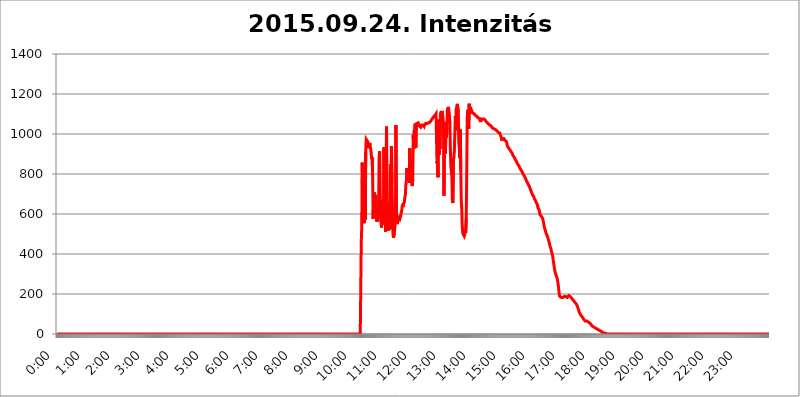
| Category | 2015.09.24. Intenzitás [W/m^2] |
|---|---|
| 0.0 | 0 |
| 0.0006944444444444445 | 0 |
| 0.001388888888888889 | 0 |
| 0.0020833333333333333 | 0 |
| 0.002777777777777778 | 0 |
| 0.003472222222222222 | 0 |
| 0.004166666666666667 | 0 |
| 0.004861111111111111 | 0 |
| 0.005555555555555556 | 0 |
| 0.0062499999999999995 | 0 |
| 0.006944444444444444 | 0 |
| 0.007638888888888889 | 0 |
| 0.008333333333333333 | 0 |
| 0.009027777777777779 | 0 |
| 0.009722222222222222 | 0 |
| 0.010416666666666666 | 0 |
| 0.011111111111111112 | 0 |
| 0.011805555555555555 | 0 |
| 0.012499999999999999 | 0 |
| 0.013194444444444444 | 0 |
| 0.013888888888888888 | 0 |
| 0.014583333333333332 | 0 |
| 0.015277777777777777 | 0 |
| 0.015972222222222224 | 0 |
| 0.016666666666666666 | 0 |
| 0.017361111111111112 | 0 |
| 0.018055555555555557 | 0 |
| 0.01875 | 0 |
| 0.019444444444444445 | 0 |
| 0.02013888888888889 | 0 |
| 0.020833333333333332 | 0 |
| 0.02152777777777778 | 0 |
| 0.022222222222222223 | 0 |
| 0.02291666666666667 | 0 |
| 0.02361111111111111 | 0 |
| 0.024305555555555556 | 0 |
| 0.024999999999999998 | 0 |
| 0.025694444444444447 | 0 |
| 0.02638888888888889 | 0 |
| 0.027083333333333334 | 0 |
| 0.027777777777777776 | 0 |
| 0.02847222222222222 | 0 |
| 0.029166666666666664 | 0 |
| 0.029861111111111113 | 0 |
| 0.030555555555555555 | 0 |
| 0.03125 | 0 |
| 0.03194444444444445 | 0 |
| 0.03263888888888889 | 0 |
| 0.03333333333333333 | 0 |
| 0.034027777777777775 | 0 |
| 0.034722222222222224 | 0 |
| 0.035416666666666666 | 0 |
| 0.036111111111111115 | 0 |
| 0.03680555555555556 | 0 |
| 0.0375 | 0 |
| 0.03819444444444444 | 0 |
| 0.03888888888888889 | 0 |
| 0.03958333333333333 | 0 |
| 0.04027777777777778 | 0 |
| 0.04097222222222222 | 0 |
| 0.041666666666666664 | 0 |
| 0.042361111111111106 | 0 |
| 0.04305555555555556 | 0 |
| 0.043750000000000004 | 0 |
| 0.044444444444444446 | 0 |
| 0.04513888888888889 | 0 |
| 0.04583333333333334 | 0 |
| 0.04652777777777778 | 0 |
| 0.04722222222222222 | 0 |
| 0.04791666666666666 | 0 |
| 0.04861111111111111 | 0 |
| 0.049305555555555554 | 0 |
| 0.049999999999999996 | 0 |
| 0.05069444444444445 | 0 |
| 0.051388888888888894 | 0 |
| 0.052083333333333336 | 0 |
| 0.05277777777777778 | 0 |
| 0.05347222222222222 | 0 |
| 0.05416666666666667 | 0 |
| 0.05486111111111111 | 0 |
| 0.05555555555555555 | 0 |
| 0.05625 | 0 |
| 0.05694444444444444 | 0 |
| 0.057638888888888885 | 0 |
| 0.05833333333333333 | 0 |
| 0.05902777777777778 | 0 |
| 0.059722222222222225 | 0 |
| 0.06041666666666667 | 0 |
| 0.061111111111111116 | 0 |
| 0.06180555555555556 | 0 |
| 0.0625 | 0 |
| 0.06319444444444444 | 0 |
| 0.06388888888888888 | 0 |
| 0.06458333333333334 | 0 |
| 0.06527777777777778 | 0 |
| 0.06597222222222222 | 0 |
| 0.06666666666666667 | 0 |
| 0.06736111111111111 | 0 |
| 0.06805555555555555 | 0 |
| 0.06874999999999999 | 0 |
| 0.06944444444444443 | 0 |
| 0.07013888888888889 | 0 |
| 0.07083333333333333 | 0 |
| 0.07152777777777779 | 0 |
| 0.07222222222222223 | 0 |
| 0.07291666666666667 | 0 |
| 0.07361111111111111 | 0 |
| 0.07430555555555556 | 0 |
| 0.075 | 0 |
| 0.07569444444444444 | 0 |
| 0.0763888888888889 | 0 |
| 0.07708333333333334 | 0 |
| 0.07777777777777778 | 0 |
| 0.07847222222222222 | 0 |
| 0.07916666666666666 | 0 |
| 0.0798611111111111 | 0 |
| 0.08055555555555556 | 0 |
| 0.08125 | 0 |
| 0.08194444444444444 | 0 |
| 0.08263888888888889 | 0 |
| 0.08333333333333333 | 0 |
| 0.08402777777777777 | 0 |
| 0.08472222222222221 | 0 |
| 0.08541666666666665 | 0 |
| 0.08611111111111112 | 0 |
| 0.08680555555555557 | 0 |
| 0.08750000000000001 | 0 |
| 0.08819444444444445 | 0 |
| 0.08888888888888889 | 0 |
| 0.08958333333333333 | 0 |
| 0.09027777777777778 | 0 |
| 0.09097222222222222 | 0 |
| 0.09166666666666667 | 0 |
| 0.09236111111111112 | 0 |
| 0.09305555555555556 | 0 |
| 0.09375 | 0 |
| 0.09444444444444444 | 0 |
| 0.09513888888888888 | 0 |
| 0.09583333333333333 | 0 |
| 0.09652777777777777 | 0 |
| 0.09722222222222222 | 0 |
| 0.09791666666666667 | 0 |
| 0.09861111111111111 | 0 |
| 0.09930555555555555 | 0 |
| 0.09999999999999999 | 0 |
| 0.10069444444444443 | 0 |
| 0.1013888888888889 | 0 |
| 0.10208333333333335 | 0 |
| 0.10277777777777779 | 0 |
| 0.10347222222222223 | 0 |
| 0.10416666666666667 | 0 |
| 0.10486111111111111 | 0 |
| 0.10555555555555556 | 0 |
| 0.10625 | 0 |
| 0.10694444444444444 | 0 |
| 0.1076388888888889 | 0 |
| 0.10833333333333334 | 0 |
| 0.10902777777777778 | 0 |
| 0.10972222222222222 | 0 |
| 0.1111111111111111 | 0 |
| 0.11180555555555556 | 0 |
| 0.11180555555555556 | 0 |
| 0.1125 | 0 |
| 0.11319444444444444 | 0 |
| 0.11388888888888889 | 0 |
| 0.11458333333333333 | 0 |
| 0.11527777777777777 | 0 |
| 0.11597222222222221 | 0 |
| 0.11666666666666665 | 0 |
| 0.1173611111111111 | 0 |
| 0.11805555555555557 | 0 |
| 0.11944444444444445 | 0 |
| 0.12013888888888889 | 0 |
| 0.12083333333333333 | 0 |
| 0.12152777777777778 | 0 |
| 0.12222222222222223 | 0 |
| 0.12291666666666667 | 0 |
| 0.12291666666666667 | 0 |
| 0.12361111111111112 | 0 |
| 0.12430555555555556 | 0 |
| 0.125 | 0 |
| 0.12569444444444444 | 0 |
| 0.12638888888888888 | 0 |
| 0.12708333333333333 | 0 |
| 0.16875 | 0 |
| 0.12847222222222224 | 0 |
| 0.12916666666666668 | 0 |
| 0.12986111111111112 | 0 |
| 0.13055555555555556 | 0 |
| 0.13125 | 0 |
| 0.13194444444444445 | 0 |
| 0.1326388888888889 | 0 |
| 0.13333333333333333 | 0 |
| 0.13402777777777777 | 0 |
| 0.13402777777777777 | 0 |
| 0.13472222222222222 | 0 |
| 0.13541666666666666 | 0 |
| 0.1361111111111111 | 0 |
| 0.13749999999999998 | 0 |
| 0.13819444444444443 | 0 |
| 0.1388888888888889 | 0 |
| 0.13958333333333334 | 0 |
| 0.14027777777777778 | 0 |
| 0.14097222222222222 | 0 |
| 0.14166666666666666 | 0 |
| 0.1423611111111111 | 0 |
| 0.14305555555555557 | 0 |
| 0.14375000000000002 | 0 |
| 0.14444444444444446 | 0 |
| 0.1451388888888889 | 0 |
| 0.1451388888888889 | 0 |
| 0.14652777777777778 | 0 |
| 0.14722222222222223 | 0 |
| 0.14791666666666667 | 0 |
| 0.1486111111111111 | 0 |
| 0.14930555555555555 | 0 |
| 0.15 | 0 |
| 0.15069444444444444 | 0 |
| 0.15138888888888888 | 0 |
| 0.15208333333333332 | 0 |
| 0.15277777777777776 | 0 |
| 0.15347222222222223 | 0 |
| 0.15416666666666667 | 0 |
| 0.15486111111111112 | 0 |
| 0.15555555555555556 | 0 |
| 0.15625 | 0 |
| 0.15694444444444444 | 0 |
| 0.15763888888888888 | 0 |
| 0.15833333333333333 | 0 |
| 0.15902777777777777 | 0 |
| 0.15972222222222224 | 0 |
| 0.16041666666666668 | 0 |
| 0.16111111111111112 | 0 |
| 0.16180555555555556 | 0 |
| 0.1625 | 0 |
| 0.16319444444444445 | 0 |
| 0.1638888888888889 | 0 |
| 0.16458333333333333 | 0 |
| 0.16527777777777777 | 0 |
| 0.16597222222222222 | 0 |
| 0.16666666666666666 | 0 |
| 0.1673611111111111 | 0 |
| 0.16805555555555554 | 0 |
| 0.16874999999999998 | 0 |
| 0.16944444444444443 | 0 |
| 0.17013888888888887 | 0 |
| 0.1708333333333333 | 0 |
| 0.17152777777777775 | 0 |
| 0.17222222222222225 | 0 |
| 0.1729166666666667 | 0 |
| 0.17361111111111113 | 0 |
| 0.17430555555555557 | 0 |
| 0.17500000000000002 | 0 |
| 0.17569444444444446 | 0 |
| 0.1763888888888889 | 0 |
| 0.17708333333333334 | 0 |
| 0.17777777777777778 | 0 |
| 0.17847222222222223 | 0 |
| 0.17916666666666667 | 0 |
| 0.1798611111111111 | 0 |
| 0.18055555555555555 | 0 |
| 0.18125 | 0 |
| 0.18194444444444444 | 0 |
| 0.1826388888888889 | 0 |
| 0.18333333333333335 | 0 |
| 0.1840277777777778 | 0 |
| 0.18472222222222223 | 0 |
| 0.18541666666666667 | 0 |
| 0.18611111111111112 | 0 |
| 0.18680555555555556 | 0 |
| 0.1875 | 0 |
| 0.18819444444444444 | 0 |
| 0.18888888888888888 | 0 |
| 0.18958333333333333 | 0 |
| 0.19027777777777777 | 0 |
| 0.1909722222222222 | 0 |
| 0.19166666666666665 | 0 |
| 0.19236111111111112 | 0 |
| 0.19305555555555554 | 0 |
| 0.19375 | 0 |
| 0.19444444444444445 | 0 |
| 0.1951388888888889 | 0 |
| 0.19583333333333333 | 0 |
| 0.19652777777777777 | 0 |
| 0.19722222222222222 | 0 |
| 0.19791666666666666 | 0 |
| 0.1986111111111111 | 0 |
| 0.19930555555555554 | 0 |
| 0.19999999999999998 | 0 |
| 0.20069444444444443 | 0 |
| 0.20138888888888887 | 0 |
| 0.2020833333333333 | 0 |
| 0.2027777777777778 | 0 |
| 0.2034722222222222 | 0 |
| 0.2041666666666667 | 0 |
| 0.20486111111111113 | 0 |
| 0.20555555555555557 | 0 |
| 0.20625000000000002 | 0 |
| 0.20694444444444446 | 0 |
| 0.2076388888888889 | 0 |
| 0.20833333333333334 | 0 |
| 0.20902777777777778 | 0 |
| 0.20972222222222223 | 0 |
| 0.21041666666666667 | 0 |
| 0.2111111111111111 | 0 |
| 0.21180555555555555 | 0 |
| 0.2125 | 0 |
| 0.21319444444444444 | 0 |
| 0.2138888888888889 | 0 |
| 0.21458333333333335 | 0 |
| 0.2152777777777778 | 0 |
| 0.21597222222222223 | 0 |
| 0.21666666666666667 | 0 |
| 0.21736111111111112 | 0 |
| 0.21805555555555556 | 0 |
| 0.21875 | 0 |
| 0.21944444444444444 | 0 |
| 0.22013888888888888 | 0 |
| 0.22083333333333333 | 0 |
| 0.22152777777777777 | 0 |
| 0.2222222222222222 | 0 |
| 0.22291666666666665 | 0 |
| 0.2236111111111111 | 0 |
| 0.22430555555555556 | 0 |
| 0.225 | 0 |
| 0.22569444444444445 | 0 |
| 0.2263888888888889 | 0 |
| 0.22708333333333333 | 0 |
| 0.22777777777777777 | 0 |
| 0.22847222222222222 | 0 |
| 0.22916666666666666 | 0 |
| 0.2298611111111111 | 0 |
| 0.23055555555555554 | 0 |
| 0.23124999999999998 | 0 |
| 0.23194444444444443 | 0 |
| 0.23263888888888887 | 0 |
| 0.2333333333333333 | 0 |
| 0.2340277777777778 | 0 |
| 0.2347222222222222 | 0 |
| 0.2354166666666667 | 0 |
| 0.23611111111111113 | 0 |
| 0.23680555555555557 | 0 |
| 0.23750000000000002 | 0 |
| 0.23819444444444446 | 0 |
| 0.2388888888888889 | 0 |
| 0.23958333333333334 | 0 |
| 0.24027777777777778 | 0 |
| 0.24097222222222223 | 0 |
| 0.24166666666666667 | 0 |
| 0.2423611111111111 | 0 |
| 0.24305555555555555 | 0 |
| 0.24375 | 0 |
| 0.24444444444444446 | 0 |
| 0.24513888888888888 | 0 |
| 0.24583333333333335 | 0 |
| 0.2465277777777778 | 0 |
| 0.24722222222222223 | 0 |
| 0.24791666666666667 | 0 |
| 0.24861111111111112 | 0 |
| 0.24930555555555556 | 0 |
| 0.25 | 0 |
| 0.25069444444444444 | 0 |
| 0.2513888888888889 | 0 |
| 0.2520833333333333 | 0 |
| 0.25277777777777777 | 0 |
| 0.2534722222222222 | 0 |
| 0.25416666666666665 | 0 |
| 0.2548611111111111 | 0 |
| 0.2555555555555556 | 0 |
| 0.25625000000000003 | 0 |
| 0.2569444444444445 | 0 |
| 0.2576388888888889 | 0 |
| 0.25833333333333336 | 0 |
| 0.2590277777777778 | 0 |
| 0.25972222222222224 | 0 |
| 0.2604166666666667 | 0 |
| 0.2611111111111111 | 0 |
| 0.26180555555555557 | 0 |
| 0.2625 | 0 |
| 0.26319444444444445 | 0 |
| 0.2638888888888889 | 0 |
| 0.26458333333333334 | 0 |
| 0.2652777777777778 | 0 |
| 0.2659722222222222 | 0 |
| 0.26666666666666666 | 0 |
| 0.2673611111111111 | 0 |
| 0.26805555555555555 | 0 |
| 0.26875 | 0 |
| 0.26944444444444443 | 0 |
| 0.2701388888888889 | 0 |
| 0.2708333333333333 | 0 |
| 0.27152777777777776 | 0 |
| 0.2722222222222222 | 0 |
| 0.27291666666666664 | 0 |
| 0.2736111111111111 | 0 |
| 0.2743055555555555 | 0 |
| 0.27499999999999997 | 0 |
| 0.27569444444444446 | 0 |
| 0.27638888888888885 | 0 |
| 0.27708333333333335 | 0 |
| 0.2777777777777778 | 0 |
| 0.27847222222222223 | 0 |
| 0.2791666666666667 | 0 |
| 0.2798611111111111 | 0 |
| 0.28055555555555556 | 0 |
| 0.28125 | 0 |
| 0.28194444444444444 | 0 |
| 0.2826388888888889 | 0 |
| 0.2833333333333333 | 0 |
| 0.28402777777777777 | 0 |
| 0.2847222222222222 | 0 |
| 0.28541666666666665 | 0 |
| 0.28611111111111115 | 0 |
| 0.28680555555555554 | 0 |
| 0.28750000000000003 | 0 |
| 0.2881944444444445 | 0 |
| 0.2888888888888889 | 0 |
| 0.28958333333333336 | 0 |
| 0.2902777777777778 | 0 |
| 0.29097222222222224 | 0 |
| 0.2916666666666667 | 0 |
| 0.2923611111111111 | 0 |
| 0.29305555555555557 | 0 |
| 0.29375 | 0 |
| 0.29444444444444445 | 0 |
| 0.2951388888888889 | 0 |
| 0.29583333333333334 | 0 |
| 0.2965277777777778 | 0 |
| 0.2972222222222222 | 0 |
| 0.29791666666666666 | 0 |
| 0.2986111111111111 | 0 |
| 0.29930555555555555 | 0 |
| 0.3 | 0 |
| 0.30069444444444443 | 0 |
| 0.3013888888888889 | 0 |
| 0.3020833333333333 | 0 |
| 0.30277777777777776 | 0 |
| 0.3034722222222222 | 0 |
| 0.30416666666666664 | 0 |
| 0.3048611111111111 | 0 |
| 0.3055555555555555 | 0 |
| 0.30624999999999997 | 0 |
| 0.3069444444444444 | 0 |
| 0.3076388888888889 | 0 |
| 0.30833333333333335 | 0 |
| 0.3090277777777778 | 0 |
| 0.30972222222222223 | 0 |
| 0.3104166666666667 | 0 |
| 0.3111111111111111 | 0 |
| 0.31180555555555556 | 0 |
| 0.3125 | 0 |
| 0.31319444444444444 | 0 |
| 0.3138888888888889 | 0 |
| 0.3145833333333333 | 0 |
| 0.31527777777777777 | 0 |
| 0.3159722222222222 | 0 |
| 0.31666666666666665 | 0 |
| 0.31736111111111115 | 0 |
| 0.31805555555555554 | 0 |
| 0.31875000000000003 | 0 |
| 0.3194444444444445 | 0 |
| 0.3201388888888889 | 0 |
| 0.32083333333333336 | 0 |
| 0.3215277777777778 | 0 |
| 0.32222222222222224 | 0 |
| 0.3229166666666667 | 0 |
| 0.3236111111111111 | 0 |
| 0.32430555555555557 | 0 |
| 0.325 | 0 |
| 0.32569444444444445 | 0 |
| 0.3263888888888889 | 0 |
| 0.32708333333333334 | 0 |
| 0.3277777777777778 | 0 |
| 0.3284722222222222 | 0 |
| 0.32916666666666666 | 0 |
| 0.3298611111111111 | 0 |
| 0.33055555555555555 | 0 |
| 0.33125 | 0 |
| 0.33194444444444443 | 0 |
| 0.3326388888888889 | 0 |
| 0.3333333333333333 | 0 |
| 0.3340277777777778 | 0 |
| 0.3347222222222222 | 0 |
| 0.3354166666666667 | 0 |
| 0.3361111111111111 | 0 |
| 0.3368055555555556 | 0 |
| 0.33749999999999997 | 0 |
| 0.33819444444444446 | 0 |
| 0.33888888888888885 | 0 |
| 0.33958333333333335 | 0 |
| 0.34027777777777773 | 0 |
| 0.34097222222222223 | 0 |
| 0.3416666666666666 | 0 |
| 0.3423611111111111 | 0 |
| 0.3430555555555555 | 0 |
| 0.34375 | 0 |
| 0.3444444444444445 | 0 |
| 0.3451388888888889 | 0 |
| 0.3458333333333334 | 0 |
| 0.34652777777777777 | 0 |
| 0.34722222222222227 | 0 |
| 0.34791666666666665 | 0 |
| 0.34861111111111115 | 0 |
| 0.34930555555555554 | 0 |
| 0.35000000000000003 | 0 |
| 0.3506944444444444 | 0 |
| 0.3513888888888889 | 0 |
| 0.3520833333333333 | 0 |
| 0.3527777777777778 | 0 |
| 0.3534722222222222 | 0 |
| 0.3541666666666667 | 0 |
| 0.3548611111111111 | 0 |
| 0.35555555555555557 | 0 |
| 0.35625 | 0 |
| 0.35694444444444445 | 0 |
| 0.3576388888888889 | 0 |
| 0.35833333333333334 | 0 |
| 0.3590277777777778 | 0 |
| 0.3597222222222222 | 0 |
| 0.36041666666666666 | 0 |
| 0.3611111111111111 | 0 |
| 0.36180555555555555 | 0 |
| 0.3625 | 0 |
| 0.36319444444444443 | 0 |
| 0.3638888888888889 | 0 |
| 0.3645833333333333 | 0 |
| 0.3652777777777778 | 0 |
| 0.3659722222222222 | 0 |
| 0.3666666666666667 | 0 |
| 0.3673611111111111 | 0 |
| 0.3680555555555556 | 0 |
| 0.36874999999999997 | 0 |
| 0.36944444444444446 | 0 |
| 0.37013888888888885 | 0 |
| 0.37083333333333335 | 0 |
| 0.37152777777777773 | 0 |
| 0.37222222222222223 | 0 |
| 0.3729166666666666 | 0 |
| 0.3736111111111111 | 0 |
| 0.3743055555555555 | 0 |
| 0.375 | 0 |
| 0.3756944444444445 | 0 |
| 0.3763888888888889 | 0 |
| 0.3770833333333334 | 0 |
| 0.37777777777777777 | 0 |
| 0.37847222222222227 | 0 |
| 0.37916666666666665 | 0 |
| 0.37986111111111115 | 0 |
| 0.38055555555555554 | 0 |
| 0.38125000000000003 | 0 |
| 0.3819444444444444 | 0 |
| 0.3826388888888889 | 0 |
| 0.3833333333333333 | 0 |
| 0.3840277777777778 | 0 |
| 0.3847222222222222 | 0 |
| 0.3854166666666667 | 0 |
| 0.3861111111111111 | 0 |
| 0.38680555555555557 | 0 |
| 0.3875 | 0 |
| 0.38819444444444445 | 0 |
| 0.3888888888888889 | 0 |
| 0.38958333333333334 | 0 |
| 0.3902777777777778 | 0 |
| 0.3909722222222222 | 0 |
| 0.39166666666666666 | 0 |
| 0.3923611111111111 | 0 |
| 0.39305555555555555 | 0 |
| 0.39375 | 0 |
| 0.39444444444444443 | 0 |
| 0.3951388888888889 | 0 |
| 0.3958333333333333 | 0 |
| 0.3965277777777778 | 0 |
| 0.3972222222222222 | 0 |
| 0.3979166666666667 | 0 |
| 0.3986111111111111 | 0 |
| 0.3993055555555556 | 0 |
| 0.39999999999999997 | 0 |
| 0.40069444444444446 | 0 |
| 0.40138888888888885 | 0 |
| 0.40208333333333335 | 0 |
| 0.40277777777777773 | 0 |
| 0.40347222222222223 | 0 |
| 0.4041666666666666 | 0 |
| 0.4048611111111111 | 0 |
| 0.4055555555555555 | 0 |
| 0.40625 | 0 |
| 0.4069444444444445 | 0 |
| 0.4076388888888889 | 0 |
| 0.4083333333333334 | 0 |
| 0.40902777777777777 | 0 |
| 0.40972222222222227 | 0 |
| 0.41041666666666665 | 0 |
| 0.41111111111111115 | 0 |
| 0.41180555555555554 | 0 |
| 0.41250000000000003 | 0 |
| 0.4131944444444444 | 0 |
| 0.4138888888888889 | 0 |
| 0.4145833333333333 | 0 |
| 0.4152777777777778 | 0 |
| 0.4159722222222222 | 0 |
| 0.4166666666666667 | 0 |
| 0.4173611111111111 | 0 |
| 0.41805555555555557 | 0 |
| 0.41875 | 0 |
| 0.41944444444444445 | 0 |
| 0.4201388888888889 | 0 |
| 0.42083333333333334 | 0 |
| 0.4215277777777778 | 0 |
| 0.4222222222222222 | 0 |
| 0.42291666666666666 | 0 |
| 0.4236111111111111 | 0 |
| 0.42430555555555555 | 0 |
| 0.425 | 0 |
| 0.42569444444444443 | 0 |
| 0.4263888888888889 | 458.38 |
| 0.4270833333333333 | 532.513 |
| 0.4277777777777778 | 856.855 |
| 0.4284722222222222 | 600.661 |
| 0.4291666666666667 | 634.105 |
| 0.4298611111111111 | 571.049 |
| 0.4305555555555556 | 553.986 |
| 0.43124999999999997 | 759.723 |
| 0.43194444444444446 | 571.049 |
| 0.43263888888888885 | 909.996 |
| 0.43333333333333335 | 973.772 |
| 0.43402777777777773 | 973.772 |
| 0.43472222222222223 | 966.295 |
| 0.4354166666666666 | 962.555 |
| 0.4361111111111111 | 955.071 |
| 0.4368055555555555 | 928.819 |
| 0.4375 | 940.082 |
| 0.4381944444444445 | 955.071 |
| 0.4388888888888889 | 943.832 |
| 0.4395833333333334 | 940.082 |
| 0.44027777777777777 | 906.223 |
| 0.44097222222222227 | 875.918 |
| 0.44166666666666665 | 883.516 |
| 0.44236111111111115 | 791.169 |
| 0.44305555555555554 | 575.299 |
| 0.44375000000000003 | 667.123 |
| 0.4444444444444444 | 707.8 |
| 0.4451388888888889 | 671.22 |
| 0.4458333333333333 | 621.613 |
| 0.4465277777777778 | 695.666 |
| 0.4472222222222222 | 625.784 |
| 0.4479166666666667 | 562.53 |
| 0.4486111111111111 | 583.779 |
| 0.44930555555555557 | 562.53 |
| 0.45 | 600.661 |
| 0.45069444444444445 | 617.436 |
| 0.4513888888888889 | 879.719 |
| 0.45208333333333334 | 913.766 |
| 0.4527777777777778 | 634.105 |
| 0.4534722222222222 | 588.009 |
| 0.45416666666666666 | 553.986 |
| 0.4548611111111111 | 532.513 |
| 0.45555555555555555 | 663.019 |
| 0.45625 | 571.049 |
| 0.45694444444444443 | 671.22 |
| 0.4576388888888889 | 545.416 |
| 0.4583333333333333 | 932.576 |
| 0.4590277777777778 | 663.019 |
| 0.4597222222222222 | 868.305 |
| 0.4604166666666667 | 510.885 |
| 0.4611111111111111 | 798.974 |
| 0.4618055555555556 | 1037.277 |
| 0.46249999999999997 | 558.261 |
| 0.46319444444444446 | 663.019 |
| 0.46388888888888885 | 515.223 |
| 0.46458333333333335 | 545.416 |
| 0.46527777777777773 | 528.2 |
| 0.46597222222222223 | 562.53 |
| 0.4666666666666666 | 541.121 |
| 0.4673611111111111 | 849.199 |
| 0.4680555555555555 | 523.88 |
| 0.46875 | 940.082 |
| 0.4694444444444445 | 751.803 |
| 0.4701388888888889 | 625.784 |
| 0.4708333333333334 | 502.192 |
| 0.47152777777777777 | 480.356 |
| 0.47222222222222227 | 480.356 |
| 0.47291666666666665 | 506.542 |
| 0.47361111111111115 | 536.82 |
| 0.47430555555555554 | 566.793 |
| 0.47500000000000003 | 1044.762 |
| 0.4756944444444444 | 571.049 |
| 0.4763888888888889 | 558.261 |
| 0.4770833333333333 | 549.704 |
| 0.4777777777777778 | 566.793 |
| 0.4784722222222222 | 583.779 |
| 0.4791666666666667 | 588.009 |
| 0.4798611111111111 | 583.779 |
| 0.48055555555555557 | 575.299 |
| 0.48125 | 575.299 |
| 0.48194444444444445 | 596.45 |
| 0.4826388888888889 | 609.062 |
| 0.48333333333333334 | 621.613 |
| 0.4840277777777778 | 646.537 |
| 0.4847222222222222 | 634.105 |
| 0.48541666666666666 | 650.667 |
| 0.4861111111111111 | 654.791 |
| 0.48680555555555555 | 658.909 |
| 0.4875 | 683.473 |
| 0.48819444444444443 | 691.608 |
| 0.4888888888888889 | 743.859 |
| 0.4895833333333333 | 759.723 |
| 0.4902777777777778 | 829.981 |
| 0.4909722222222222 | 795.074 |
| 0.4916666666666667 | 775.492 |
| 0.4923611111111111 | 783.342 |
| 0.4930555555555556 | 806.757 |
| 0.49374999999999997 | 755.766 |
| 0.49444444444444446 | 928.819 |
| 0.49513888888888885 | 767.62 |
| 0.49583333333333335 | 872.114 |
| 0.49652777777777773 | 775.492 |
| 0.49722222222222223 | 751.803 |
| 0.4979166666666666 | 739.877 |
| 0.4986111111111111 | 771.559 |
| 0.4993055555555555 | 996.182 |
| 0.5 | 925.06 |
| 0.5006944444444444 | 1014.852 |
| 0.5013888888888889 | 1022.323 |
| 0.5020833333333333 | 1052.255 |
| 0.5027777777777778 | 932.576 |
| 0.5034722222222222 | 1003.65 |
| 0.5041666666666667 | 1052.255 |
| 0.5048611111111111 | 1048.508 |
| 0.5055555555555555 | 1056.004 |
| 0.50625 | 1056.004 |
| 0.5069444444444444 | 1048.508 |
| 0.5076388888888889 | 1041.019 |
| 0.5083333333333333 | 1041.019 |
| 0.5090277777777777 | 1037.277 |
| 0.5097222222222222 | 1033.537 |
| 0.5104166666666666 | 1037.277 |
| 0.5111111111111112 | 1044.762 |
| 0.5118055555555555 | 1044.762 |
| 0.5125000000000001 | 1044.762 |
| 0.5131944444444444 | 1044.762 |
| 0.513888888888889 | 1041.019 |
| 0.5145833333333333 | 1037.277 |
| 0.5152777777777778 | 1044.762 |
| 0.5159722222222222 | 1044.762 |
| 0.5166666666666667 | 1052.255 |
| 0.517361111111111 | 1052.255 |
| 0.5180555555555556 | 1052.255 |
| 0.5187499999999999 | 1052.255 |
| 0.5194444444444445 | 1048.508 |
| 0.5201388888888888 | 1048.508 |
| 0.5208333333333334 | 1056.004 |
| 0.5215277777777778 | 1059.756 |
| 0.5222222222222223 | 1056.004 |
| 0.5229166666666667 | 1059.756 |
| 0.5236111111111111 | 1059.756 |
| 0.5243055555555556 | 1067.267 |
| 0.525 | 1071.027 |
| 0.5256944444444445 | 1074.789 |
| 0.5263888888888889 | 1078.555 |
| 0.5270833333333333 | 1078.555 |
| 0.5277777777777778 | 1086.097 |
| 0.5284722222222222 | 1086.097 |
| 0.5291666666666667 | 1089.873 |
| 0.5298611111111111 | 1093.653 |
| 0.5305555555555556 | 1093.653 |
| 0.53125 | 1101.226 |
| 0.5319444444444444 | 1101.226 |
| 0.5326388888888889 | 853.029 |
| 0.5333333333333333 | 868.305 |
| 0.5340277777777778 | 783.342 |
| 0.5347222222222222 | 1071.027 |
| 0.5354166666666667 | 894.885 |
| 0.5361111111111111 | 943.832 |
| 0.5368055555555555 | 925.06 |
| 0.5375 | 1101.226 |
| 0.5381944444444444 | 1108.816 |
| 0.5388888888888889 | 1108.816 |
| 0.5395833333333333 | 1105.019 |
| 0.5402777777777777 | 1108.816 |
| 0.5409722222222222 | 1082.324 |
| 0.5416666666666666 | 1056.004 |
| 0.5423611111111112 | 691.608 |
| 0.5430555555555555 | 981.244 |
| 0.5437500000000001 | 921.298 |
| 0.5444444444444444 | 902.447 |
| 0.545138888888889 | 1059.756 |
| 0.5458333333333333 | 981.244 |
| 0.5465277777777778 | 1029.798 |
| 0.5472222222222222 | 1127.879 |
| 0.5479166666666667 | 1101.226 |
| 0.548611111111111 | 1135.543 |
| 0.5493055555555556 | 1135.543 |
| 0.5499999999999999 | 1131.708 |
| 0.5506944444444445 | 1052.255 |
| 0.5513888888888888 | 921.298 |
| 0.5520833333333334 | 837.682 |
| 0.5527777777777778 | 810.641 |
| 0.5534722222222223 | 787.258 |
| 0.5541666666666667 | 671.22 |
| 0.5548611111111111 | 654.791 |
| 0.5555555555555556 | 868.305 |
| 0.55625 | 883.516 |
| 0.5569444444444445 | 913.766 |
| 0.5576388888888889 | 917.534 |
| 0.5583333333333333 | 1089.873 |
| 0.5590277777777778 | 1018.587 |
| 0.5597222222222222 | 1124.056 |
| 0.5604166666666667 | 1124.056 |
| 0.5611111111111111 | 1150.946 |
| 0.5618055555555556 | 1147.086 |
| 0.5625 | 1108.816 |
| 0.5631944444444444 | 955.071 |
| 0.5638888888888889 | 932.576 |
| 0.5645833333333333 | 879.719 |
| 0.5652777777777778 | 1022.323 |
| 0.5659722222222222 | 818.392 |
| 0.5666666666666667 | 667.123 |
| 0.5673611111111111 | 625.784 |
| 0.5680555555555555 | 532.513 |
| 0.56875 | 506.542 |
| 0.5694444444444444 | 497.836 |
| 0.5701388888888889 | 493.475 |
| 0.5708333333333333 | 489.108 |
| 0.5715277777777777 | 497.836 |
| 0.5722222222222222 | 515.223 |
| 0.5729166666666666 | 506.542 |
| 0.5736111111111112 | 579.542 |
| 0.5743055555555555 | 802.868 |
| 0.5750000000000001 | 1078.555 |
| 0.5756944444444444 | 1120.238 |
| 0.576388888888889 | 1112.618 |
| 0.5770833333333333 | 1026.06 |
| 0.5777777777777778 | 1150.946 |
| 0.5784722222222222 | 1101.226 |
| 0.5791666666666667 | 1131.708 |
| 0.579861111111111 | 1124.056 |
| 0.5805555555555556 | 1105.019 |
| 0.5812499999999999 | 1116.426 |
| 0.5819444444444445 | 1112.618 |
| 0.5826388888888888 | 1105.019 |
| 0.5833333333333334 | 1101.226 |
| 0.5840277777777778 | 1101.226 |
| 0.5847222222222223 | 1101.226 |
| 0.5854166666666667 | 1097.437 |
| 0.5861111111111111 | 1093.653 |
| 0.5868055555555556 | 1089.873 |
| 0.5875 | 1089.873 |
| 0.5881944444444445 | 1089.873 |
| 0.5888888888888889 | 1086.097 |
| 0.5895833333333333 | 1082.324 |
| 0.5902777777777778 | 1082.324 |
| 0.5909722222222222 | 1078.555 |
| 0.5916666666666667 | 1078.555 |
| 0.5923611111111111 | 1074.789 |
| 0.5930555555555556 | 1067.267 |
| 0.59375 | 1059.756 |
| 0.5944444444444444 | 1074.789 |
| 0.5951388888888889 | 1074.789 |
| 0.5958333333333333 | 1071.027 |
| 0.5965277777777778 | 1074.789 |
| 0.5972222222222222 | 1074.789 |
| 0.5979166666666667 | 1074.789 |
| 0.5986111111111111 | 1074.789 |
| 0.5993055555555555 | 1071.027 |
| 0.6 | 1071.027 |
| 0.6006944444444444 | 1067.267 |
| 0.6013888888888889 | 1063.51 |
| 0.6020833333333333 | 1059.756 |
| 0.6027777777777777 | 1059.756 |
| 0.6034722222222222 | 1056.004 |
| 0.6041666666666666 | 1052.255 |
| 0.6048611111111112 | 1048.508 |
| 0.6055555555555555 | 1048.508 |
| 0.6062500000000001 | 1044.762 |
| 0.6069444444444444 | 1044.762 |
| 0.607638888888889 | 1044.762 |
| 0.6083333333333333 | 1041.019 |
| 0.6090277777777778 | 1041.019 |
| 0.6097222222222222 | 1037.277 |
| 0.6104166666666667 | 1029.798 |
| 0.611111111111111 | 1026.06 |
| 0.6118055555555556 | 1026.06 |
| 0.6124999999999999 | 1026.06 |
| 0.6131944444444445 | 1026.06 |
| 0.6138888888888888 | 1026.06 |
| 0.6145833333333334 | 1022.323 |
| 0.6152777777777778 | 1018.587 |
| 0.6159722222222223 | 1018.587 |
| 0.6166666666666667 | 1014.852 |
| 0.6173611111111111 | 1014.852 |
| 0.6180555555555556 | 1011.118 |
| 0.61875 | 1007.383 |
| 0.6194444444444445 | 1007.383 |
| 0.6201388888888889 | 1003.65 |
| 0.6208333333333333 | 1003.65 |
| 0.6215277777777778 | 996.182 |
| 0.6222222222222222 | 988.714 |
| 0.6229166666666667 | 977.508 |
| 0.6236111111111111 | 966.295 |
| 0.6243055555555556 | 977.508 |
| 0.625 | 977.508 |
| 0.6256944444444444 | 981.244 |
| 0.6263888888888889 | 977.508 |
| 0.6270833333333333 | 973.772 |
| 0.6277777777777778 | 970.034 |
| 0.6284722222222222 | 970.034 |
| 0.6291666666666667 | 966.295 |
| 0.6298611111111111 | 962.555 |
| 0.6305555555555555 | 955.071 |
| 0.63125 | 940.082 |
| 0.6319444444444444 | 940.082 |
| 0.6326388888888889 | 932.576 |
| 0.6333333333333333 | 928.819 |
| 0.6340277777777777 | 925.06 |
| 0.6347222222222222 | 925.06 |
| 0.6354166666666666 | 917.534 |
| 0.6361111111111112 | 913.766 |
| 0.6368055555555555 | 909.996 |
| 0.6375000000000001 | 906.223 |
| 0.6381944444444444 | 902.447 |
| 0.638888888888889 | 894.885 |
| 0.6395833333333333 | 894.885 |
| 0.6402777777777778 | 887.309 |
| 0.6409722222222222 | 883.516 |
| 0.6416666666666667 | 879.719 |
| 0.642361111111111 | 872.114 |
| 0.6430555555555556 | 868.305 |
| 0.6437499999999999 | 864.493 |
| 0.6444444444444445 | 860.676 |
| 0.6451388888888888 | 853.029 |
| 0.6458333333333334 | 849.199 |
| 0.6465277777777778 | 845.365 |
| 0.6472222222222223 | 841.526 |
| 0.6479166666666667 | 837.682 |
| 0.6486111111111111 | 829.981 |
| 0.6493055555555556 | 826.123 |
| 0.65 | 826.123 |
| 0.6506944444444445 | 818.392 |
| 0.6513888888888889 | 814.519 |
| 0.6520833333333333 | 810.641 |
| 0.6527777777777778 | 802.868 |
| 0.6534722222222222 | 798.974 |
| 0.6541666666666667 | 795.074 |
| 0.6548611111111111 | 795.074 |
| 0.6555555555555556 | 787.258 |
| 0.65625 | 783.342 |
| 0.6569444444444444 | 775.492 |
| 0.6576388888888889 | 771.559 |
| 0.6583333333333333 | 763.674 |
| 0.6590277777777778 | 763.674 |
| 0.6597222222222222 | 755.766 |
| 0.6604166666666667 | 747.834 |
| 0.6611111111111111 | 743.859 |
| 0.6618055555555555 | 739.877 |
| 0.6625 | 735.89 |
| 0.6631944444444444 | 727.896 |
| 0.6638888888888889 | 719.877 |
| 0.6645833333333333 | 715.858 |
| 0.6652777777777777 | 707.8 |
| 0.6659722222222222 | 703.762 |
| 0.6666666666666666 | 695.666 |
| 0.6673611111111111 | 695.666 |
| 0.6680555555555556 | 687.544 |
| 0.6687500000000001 | 683.473 |
| 0.6694444444444444 | 675.311 |
| 0.6701388888888888 | 675.311 |
| 0.6708333333333334 | 667.123 |
| 0.6715277777777778 | 658.909 |
| 0.6722222222222222 | 654.791 |
| 0.6729166666666666 | 650.667 |
| 0.6736111111111112 | 642.4 |
| 0.6743055555555556 | 629.948 |
| 0.6749999999999999 | 629.948 |
| 0.6756944444444444 | 621.613 |
| 0.6763888888888889 | 613.252 |
| 0.6770833333333334 | 596.45 |
| 0.6777777777777777 | 592.233 |
| 0.6784722222222223 | 592.233 |
| 0.6791666666666667 | 588.009 |
| 0.6798611111111111 | 583.779 |
| 0.6805555555555555 | 579.542 |
| 0.68125 | 571.049 |
| 0.6819444444444445 | 558.261 |
| 0.6826388888888889 | 545.416 |
| 0.6833333333333332 | 532.513 |
| 0.6840277777777778 | 523.88 |
| 0.6847222222222222 | 515.223 |
| 0.6854166666666667 | 506.542 |
| 0.686111111111111 | 502.192 |
| 0.6868055555555556 | 493.475 |
| 0.6875 | 489.108 |
| 0.6881944444444444 | 480.356 |
| 0.688888888888889 | 471.582 |
| 0.6895833333333333 | 462.786 |
| 0.6902777777777778 | 453.968 |
| 0.6909722222222222 | 440.702 |
| 0.6916666666666668 | 436.27 |
| 0.6923611111111111 | 427.39 |
| 0.6930555555555555 | 414.035 |
| 0.69375 | 405.108 |
| 0.6944444444444445 | 396.164 |
| 0.6951388888888889 | 382.715 |
| 0.6958333333333333 | 364.728 |
| 0.6965277777777777 | 346.682 |
| 0.6972222222222223 | 328.584 |
| 0.6979166666666666 | 314.98 |
| 0.6986111111111111 | 305.898 |
| 0.6993055555555556 | 296.808 |
| 0.7000000000000001 | 292.259 |
| 0.7006944444444444 | 283.156 |
| 0.7013888888888888 | 274.047 |
| 0.7020833333333334 | 260.373 |
| 0.7027777777777778 | 242.127 |
| 0.7034722222222222 | 219.309 |
| 0.7041666666666666 | 196.497 |
| 0.7048611111111112 | 187.378 |
| 0.7055555555555556 | 182.82 |
| 0.7062499999999999 | 182.82 |
| 0.7069444444444444 | 182.82 |
| 0.7076388888888889 | 182.82 |
| 0.7083333333333334 | 182.82 |
| 0.7090277777777777 | 182.82 |
| 0.7097222222222223 | 187.378 |
| 0.7104166666666667 | 187.378 |
| 0.7111111111111111 | 187.378 |
| 0.7118055555555555 | 187.378 |
| 0.7125 | 187.378 |
| 0.7131944444444445 | 187.378 |
| 0.7138888888888889 | 182.82 |
| 0.7145833333333332 | 182.82 |
| 0.7152777777777778 | 182.82 |
| 0.7159722222222222 | 187.378 |
| 0.7166666666666667 | 187.378 |
| 0.717361111111111 | 191.937 |
| 0.7180555555555556 | 187.378 |
| 0.71875 | 187.378 |
| 0.7194444444444444 | 187.378 |
| 0.720138888888889 | 182.82 |
| 0.7208333333333333 | 182.82 |
| 0.7215277777777778 | 178.264 |
| 0.7222222222222222 | 173.709 |
| 0.7229166666666668 | 173.709 |
| 0.7236111111111111 | 169.156 |
| 0.7243055555555555 | 164.605 |
| 0.725 | 164.605 |
| 0.7256944444444445 | 160.056 |
| 0.7263888888888889 | 155.509 |
| 0.7270833333333333 | 155.509 |
| 0.7277777777777777 | 150.964 |
| 0.7284722222222223 | 146.423 |
| 0.7291666666666666 | 141.884 |
| 0.7298611111111111 | 137.347 |
| 0.7305555555555556 | 128.284 |
| 0.7312500000000001 | 119.235 |
| 0.7319444444444444 | 110.201 |
| 0.7326388888888888 | 105.69 |
| 0.7333333333333334 | 101.184 |
| 0.7340277777777778 | 96.682 |
| 0.7347222222222222 | 92.184 |
| 0.7354166666666666 | 87.692 |
| 0.7361111111111112 | 87.692 |
| 0.7368055555555556 | 83.205 |
| 0.7374999999999999 | 78.722 |
| 0.7381944444444444 | 74.246 |
| 0.7388888888888889 | 74.246 |
| 0.7395833333333334 | 69.775 |
| 0.7402777777777777 | 65.31 |
| 0.7409722222222223 | 65.31 |
| 0.7416666666666667 | 65.31 |
| 0.7423611111111111 | 65.31 |
| 0.7430555555555555 | 60.85 |
| 0.74375 | 60.85 |
| 0.7444444444444445 | 60.85 |
| 0.7451388888888889 | 56.398 |
| 0.7458333333333332 | 56.398 |
| 0.7465277777777778 | 56.398 |
| 0.7472222222222222 | 51.951 |
| 0.7479166666666667 | 51.951 |
| 0.748611111111111 | 47.511 |
| 0.7493055555555556 | 43.079 |
| 0.75 | 43.079 |
| 0.7506944444444444 | 38.653 |
| 0.751388888888889 | 38.653 |
| 0.7520833333333333 | 38.653 |
| 0.7527777777777778 | 34.234 |
| 0.7534722222222222 | 34.234 |
| 0.7541666666666668 | 29.823 |
| 0.7548611111111111 | 29.823 |
| 0.7555555555555555 | 29.823 |
| 0.75625 | 25.419 |
| 0.7569444444444445 | 25.419 |
| 0.7576388888888889 | 21.024 |
| 0.7583333333333333 | 21.024 |
| 0.7590277777777777 | 21.024 |
| 0.7597222222222223 | 16.636 |
| 0.7604166666666666 | 16.636 |
| 0.7611111111111111 | 16.636 |
| 0.7618055555555556 | 12.257 |
| 0.7625000000000001 | 12.257 |
| 0.7631944444444444 | 12.257 |
| 0.7638888888888888 | 12.257 |
| 0.7645833333333334 | 7.887 |
| 0.7652777777777778 | 7.887 |
| 0.7659722222222222 | 7.887 |
| 0.7666666666666666 | 3.525 |
| 0.7673611111111112 | 3.525 |
| 0.7680555555555556 | 3.525 |
| 0.7687499999999999 | 3.525 |
| 0.7694444444444444 | 3.525 |
| 0.7701388888888889 | 3.525 |
| 0.7708333333333334 | 0 |
| 0.7715277777777777 | 0 |
| 0.7722222222222223 | 0 |
| 0.7729166666666667 | 0 |
| 0.7736111111111111 | 0 |
| 0.7743055555555555 | 0 |
| 0.775 | 0 |
| 0.7756944444444445 | 0 |
| 0.7763888888888889 | 0 |
| 0.7770833333333332 | 0 |
| 0.7777777777777778 | 0 |
| 0.7784722222222222 | 0 |
| 0.7791666666666667 | 0 |
| 0.779861111111111 | 0 |
| 0.7805555555555556 | 0 |
| 0.78125 | 0 |
| 0.7819444444444444 | 0 |
| 0.782638888888889 | 0 |
| 0.7833333333333333 | 0 |
| 0.7840277777777778 | 0 |
| 0.7847222222222222 | 0 |
| 0.7854166666666668 | 0 |
| 0.7861111111111111 | 0 |
| 0.7868055555555555 | 0 |
| 0.7875 | 0 |
| 0.7881944444444445 | 0 |
| 0.7888888888888889 | 0 |
| 0.7895833333333333 | 0 |
| 0.7902777777777777 | 0 |
| 0.7909722222222223 | 0 |
| 0.7916666666666666 | 0 |
| 0.7923611111111111 | 0 |
| 0.7930555555555556 | 0 |
| 0.7937500000000001 | 0 |
| 0.7944444444444444 | 0 |
| 0.7951388888888888 | 0 |
| 0.7958333333333334 | 0 |
| 0.7965277777777778 | 0 |
| 0.7972222222222222 | 0 |
| 0.7979166666666666 | 0 |
| 0.7986111111111112 | 0 |
| 0.7993055555555556 | 0 |
| 0.7999999999999999 | 0 |
| 0.8006944444444444 | 0 |
| 0.8013888888888889 | 0 |
| 0.8020833333333334 | 0 |
| 0.8027777777777777 | 0 |
| 0.8034722222222223 | 0 |
| 0.8041666666666667 | 0 |
| 0.8048611111111111 | 0 |
| 0.8055555555555555 | 0 |
| 0.80625 | 0 |
| 0.8069444444444445 | 0 |
| 0.8076388888888889 | 0 |
| 0.8083333333333332 | 0 |
| 0.8090277777777778 | 0 |
| 0.8097222222222222 | 0 |
| 0.8104166666666667 | 0 |
| 0.811111111111111 | 0 |
| 0.8118055555555556 | 0 |
| 0.8125 | 0 |
| 0.8131944444444444 | 0 |
| 0.813888888888889 | 0 |
| 0.8145833333333333 | 0 |
| 0.8152777777777778 | 0 |
| 0.8159722222222222 | 0 |
| 0.8166666666666668 | 0 |
| 0.8173611111111111 | 0 |
| 0.8180555555555555 | 0 |
| 0.81875 | 0 |
| 0.8194444444444445 | 0 |
| 0.8201388888888889 | 0 |
| 0.8208333333333333 | 0 |
| 0.8215277777777777 | 0 |
| 0.8222222222222223 | 0 |
| 0.8229166666666666 | 0 |
| 0.8236111111111111 | 0 |
| 0.8243055555555556 | 0 |
| 0.8250000000000001 | 0 |
| 0.8256944444444444 | 0 |
| 0.8263888888888888 | 0 |
| 0.8270833333333334 | 0 |
| 0.8277777777777778 | 0 |
| 0.8284722222222222 | 0 |
| 0.8291666666666666 | 0 |
| 0.8298611111111112 | 0 |
| 0.8305555555555556 | 0 |
| 0.8312499999999999 | 0 |
| 0.8319444444444444 | 0 |
| 0.8326388888888889 | 0 |
| 0.8333333333333334 | 0 |
| 0.8340277777777777 | 0 |
| 0.8347222222222223 | 0 |
| 0.8354166666666667 | 0 |
| 0.8361111111111111 | 0 |
| 0.8368055555555555 | 0 |
| 0.8375 | 0 |
| 0.8381944444444445 | 0 |
| 0.8388888888888889 | 0 |
| 0.8395833333333332 | 0 |
| 0.8402777777777778 | 0 |
| 0.8409722222222222 | 0 |
| 0.8416666666666667 | 0 |
| 0.842361111111111 | 0 |
| 0.8430555555555556 | 0 |
| 0.84375 | 0 |
| 0.8444444444444444 | 0 |
| 0.845138888888889 | 0 |
| 0.8458333333333333 | 0 |
| 0.8465277777777778 | 0 |
| 0.8472222222222222 | 0 |
| 0.8479166666666668 | 0 |
| 0.8486111111111111 | 0 |
| 0.8493055555555555 | 0 |
| 0.85 | 0 |
| 0.8506944444444445 | 0 |
| 0.8513888888888889 | 0 |
| 0.8520833333333333 | 0 |
| 0.8527777777777777 | 0 |
| 0.8534722222222223 | 0 |
| 0.8541666666666666 | 0 |
| 0.8548611111111111 | 0 |
| 0.8555555555555556 | 0 |
| 0.8562500000000001 | 0 |
| 0.8569444444444444 | 0 |
| 0.8576388888888888 | 0 |
| 0.8583333333333334 | 0 |
| 0.8590277777777778 | 0 |
| 0.8597222222222222 | 0 |
| 0.8604166666666666 | 0 |
| 0.8611111111111112 | 0 |
| 0.8618055555555556 | 0 |
| 0.8624999999999999 | 0 |
| 0.8631944444444444 | 0 |
| 0.8638888888888889 | 0 |
| 0.8645833333333334 | 0 |
| 0.8652777777777777 | 0 |
| 0.8659722222222223 | 0 |
| 0.8666666666666667 | 0 |
| 0.8673611111111111 | 0 |
| 0.8680555555555555 | 0 |
| 0.86875 | 0 |
| 0.8694444444444445 | 0 |
| 0.8701388888888889 | 0 |
| 0.8708333333333332 | 0 |
| 0.8715277777777778 | 0 |
| 0.8722222222222222 | 0 |
| 0.8729166666666667 | 0 |
| 0.873611111111111 | 0 |
| 0.8743055555555556 | 0 |
| 0.875 | 0 |
| 0.8756944444444444 | 0 |
| 0.876388888888889 | 0 |
| 0.8770833333333333 | 0 |
| 0.8777777777777778 | 0 |
| 0.8784722222222222 | 0 |
| 0.8791666666666668 | 0 |
| 0.8798611111111111 | 0 |
| 0.8805555555555555 | 0 |
| 0.88125 | 0 |
| 0.8819444444444445 | 0 |
| 0.8826388888888889 | 0 |
| 0.8833333333333333 | 0 |
| 0.8840277777777777 | 0 |
| 0.8847222222222223 | 0 |
| 0.8854166666666666 | 0 |
| 0.8861111111111111 | 0 |
| 0.8868055555555556 | 0 |
| 0.8875000000000001 | 0 |
| 0.8881944444444444 | 0 |
| 0.8888888888888888 | 0 |
| 0.8895833333333334 | 0 |
| 0.8902777777777778 | 0 |
| 0.8909722222222222 | 0 |
| 0.8916666666666666 | 0 |
| 0.8923611111111112 | 0 |
| 0.8930555555555556 | 0 |
| 0.8937499999999999 | 0 |
| 0.8944444444444444 | 0 |
| 0.8951388888888889 | 0 |
| 0.8958333333333334 | 0 |
| 0.8965277777777777 | 0 |
| 0.8972222222222223 | 0 |
| 0.8979166666666667 | 0 |
| 0.8986111111111111 | 0 |
| 0.8993055555555555 | 0 |
| 0.9 | 0 |
| 0.9006944444444445 | 0 |
| 0.9013888888888889 | 0 |
| 0.9020833333333332 | 0 |
| 0.9027777777777778 | 0 |
| 0.9034722222222222 | 0 |
| 0.9041666666666667 | 0 |
| 0.904861111111111 | 0 |
| 0.9055555555555556 | 0 |
| 0.90625 | 0 |
| 0.9069444444444444 | 0 |
| 0.907638888888889 | 0 |
| 0.9083333333333333 | 0 |
| 0.9090277777777778 | 0 |
| 0.9097222222222222 | 0 |
| 0.9104166666666668 | 0 |
| 0.9111111111111111 | 0 |
| 0.9118055555555555 | 0 |
| 0.9125 | 0 |
| 0.9131944444444445 | 0 |
| 0.9138888888888889 | 0 |
| 0.9145833333333333 | 0 |
| 0.9152777777777777 | 0 |
| 0.9159722222222223 | 0 |
| 0.9166666666666666 | 0 |
| 0.9173611111111111 | 0 |
| 0.9180555555555556 | 0 |
| 0.9187500000000001 | 0 |
| 0.9194444444444444 | 0 |
| 0.9201388888888888 | 0 |
| 0.9208333333333334 | 0 |
| 0.9215277777777778 | 0 |
| 0.9222222222222222 | 0 |
| 0.9229166666666666 | 0 |
| 0.9236111111111112 | 0 |
| 0.9243055555555556 | 0 |
| 0.9249999999999999 | 0 |
| 0.9256944444444444 | 0 |
| 0.9263888888888889 | 0 |
| 0.9270833333333334 | 0 |
| 0.9277777777777777 | 0 |
| 0.9284722222222223 | 0 |
| 0.9291666666666667 | 0 |
| 0.9298611111111111 | 0 |
| 0.9305555555555555 | 0 |
| 0.93125 | 0 |
| 0.9319444444444445 | 0 |
| 0.9326388888888889 | 0 |
| 0.9333333333333332 | 0 |
| 0.9340277777777778 | 0 |
| 0.9347222222222222 | 0 |
| 0.9354166666666667 | 0 |
| 0.936111111111111 | 0 |
| 0.9368055555555556 | 0 |
| 0.9375 | 0 |
| 0.9381944444444444 | 0 |
| 0.938888888888889 | 0 |
| 0.9395833333333333 | 0 |
| 0.9402777777777778 | 0 |
| 0.9409722222222222 | 0 |
| 0.9416666666666668 | 0 |
| 0.9423611111111111 | 0 |
| 0.9430555555555555 | 0 |
| 0.94375 | 0 |
| 0.9444444444444445 | 0 |
| 0.9451388888888889 | 0 |
| 0.9458333333333333 | 0 |
| 0.9465277777777777 | 0 |
| 0.9472222222222223 | 0 |
| 0.9479166666666666 | 0 |
| 0.9486111111111111 | 0 |
| 0.9493055555555556 | 0 |
| 0.9500000000000001 | 0 |
| 0.9506944444444444 | 0 |
| 0.9513888888888888 | 0 |
| 0.9520833333333334 | 0 |
| 0.9527777777777778 | 0 |
| 0.9534722222222222 | 0 |
| 0.9541666666666666 | 0 |
| 0.9548611111111112 | 0 |
| 0.9555555555555556 | 0 |
| 0.9562499999999999 | 0 |
| 0.9569444444444444 | 0 |
| 0.9576388888888889 | 0 |
| 0.9583333333333334 | 0 |
| 0.9590277777777777 | 0 |
| 0.9597222222222223 | 0 |
| 0.9604166666666667 | 0 |
| 0.9611111111111111 | 0 |
| 0.9618055555555555 | 0 |
| 0.9625 | 0 |
| 0.9631944444444445 | 0 |
| 0.9638888888888889 | 0 |
| 0.9645833333333332 | 0 |
| 0.9652777777777778 | 0 |
| 0.9659722222222222 | 0 |
| 0.9666666666666667 | 0 |
| 0.967361111111111 | 0 |
| 0.9680555555555556 | 0 |
| 0.96875 | 0 |
| 0.9694444444444444 | 0 |
| 0.970138888888889 | 0 |
| 0.9708333333333333 | 0 |
| 0.9715277777777778 | 0 |
| 0.9722222222222222 | 0 |
| 0.9729166666666668 | 0 |
| 0.9736111111111111 | 0 |
| 0.9743055555555555 | 0 |
| 0.975 | 0 |
| 0.9756944444444445 | 0 |
| 0.9763888888888889 | 0 |
| 0.9770833333333333 | 0 |
| 0.9777777777777777 | 0 |
| 0.9784722222222223 | 0 |
| 0.9791666666666666 | 0 |
| 0.9798611111111111 | 0 |
| 0.9805555555555556 | 0 |
| 0.9812500000000001 | 0 |
| 0.9819444444444444 | 0 |
| 0.9826388888888888 | 0 |
| 0.9833333333333334 | 0 |
| 0.9840277777777778 | 0 |
| 0.9847222222222222 | 0 |
| 0.9854166666666666 | 0 |
| 0.9861111111111112 | 0 |
| 0.9868055555555556 | 0 |
| 0.9874999999999999 | 0 |
| 0.9881944444444444 | 0 |
| 0.9888888888888889 | 0 |
| 0.9895833333333334 | 0 |
| 0.9902777777777777 | 0 |
| 0.9909722222222223 | 0 |
| 0.9916666666666667 | 0 |
| 0.9923611111111111 | 0 |
| 0.9930555555555555 | 0 |
| 0.99375 | 0 |
| 0.9944444444444445 | 0 |
| 0.9951388888888889 | 0 |
| 0.9958333333333332 | 0 |
| 0.9965277777777778 | 0 |
| 0.9972222222222222 | 0 |
| 0.9979166666666667 | 0 |
| 0.998611111111111 | 0 |
| 0.9993055555555556 | 0 |